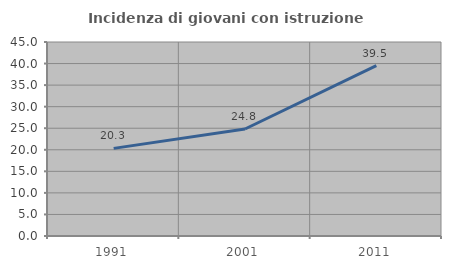
| Category | Incidenza di giovani con istruzione universitaria |
|---|---|
| 1991.0 | 20.325 |
| 2001.0 | 24.824 |
| 2011.0 | 39.535 |